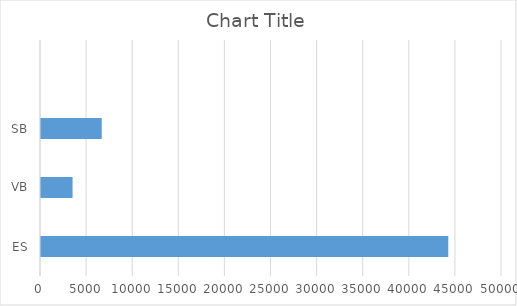
| Category | Series 0 |
|---|---|
| ES | 44173.91 |
| VB | 3422.34 |
| SB | 6588.27 |